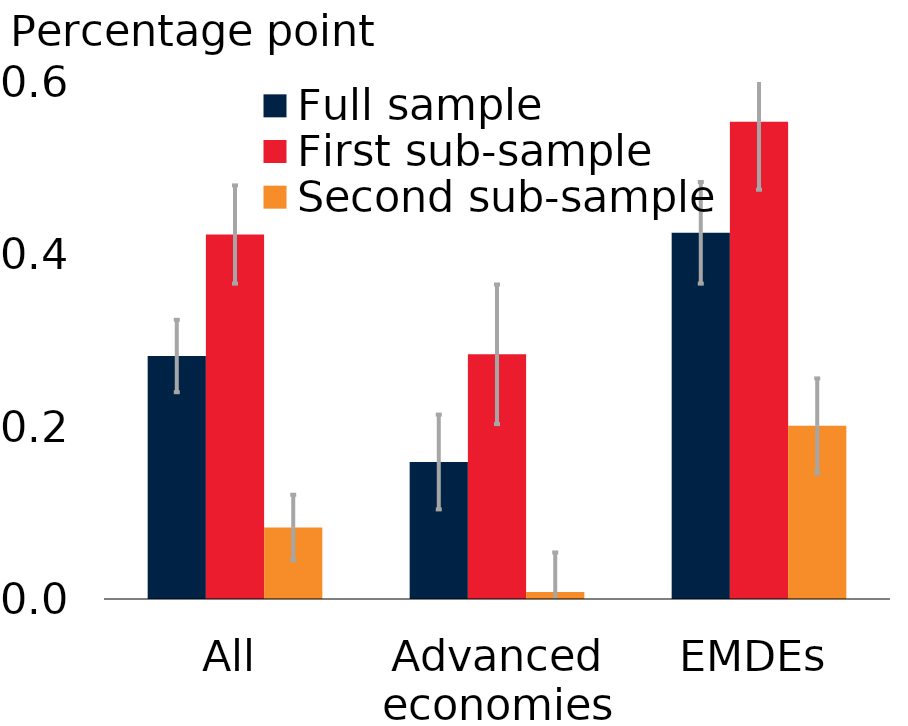
| Category | Full sample | First sub-sample | Second sub-sample |
|---|---|---|---|
| All | 0.282 | 0.423 | 0.083 |
| Advanced
economies | 0.159 | 0.284 | 0.008 |
| EMDEs | 0.425 | 0.554 | 0.201 |